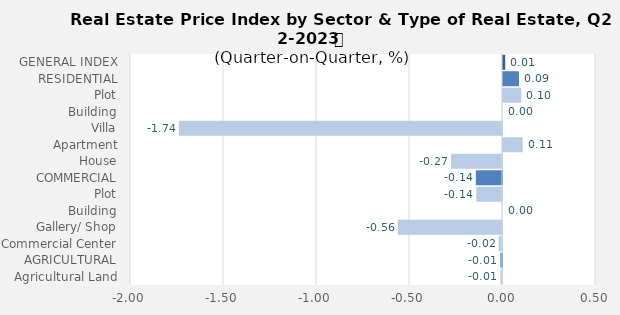
| Category | Q1-2023 |
|---|---|
| GENERAL INDEX | 0.012 |
| RESIDENTIAL | 0.086 |
| Plot | 0.098 |
| Building | 0 |
| Villa | -1.737 |
| Apartment | 0.106 |
| House | -0.274 |
| COMMERCIAL | -0.141 |
| Plot | -0.138 |
| Building | 0 |
| Gallery/ Shop | -0.56 |
| Commercial Center | -0.019 |
| AGRICULTURAL | -0.009 |
| Agricultural Land | -0.009 |